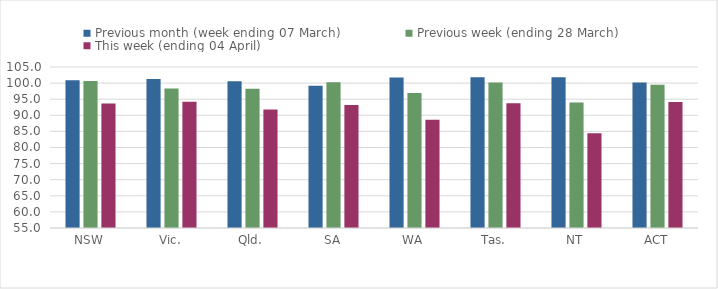
| Category | Previous month (week ending 07 March) | Previous week (ending 28 March) | This week (ending 04 April) |
|---|---|---|---|
| NSW | 100.856 | 100.626 | 93.67 |
| Vic. | 101.247 | 98.348 | 94.201 |
| Qld. | 100.565 | 98.275 | 91.766 |
| SA | 99.171 | 100.262 | 93.191 |
| WA | 101.775 | 96.893 | 88.646 |
| Tas. | 101.786 | 100.179 | 93.75 |
| NT | 101.796 | 94.012 | 84.431 |
| ACT | 100.181 | 99.458 | 94.123 |